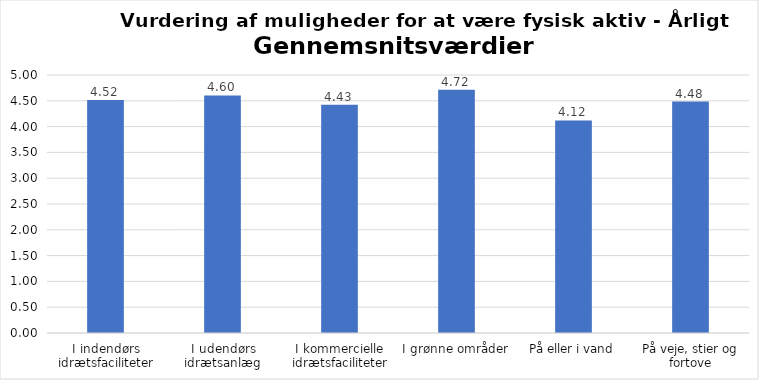
| Category | Gennemsnit |
|---|---|
| I indendørs idrætsfaciliteter | 4.515 |
| I udendørs idrætsanlæg | 4.604 |
| I kommercielle idrætsfaciliteter | 4.425 |
| I grønne områder | 4.716 |
| På eller i vand | 4.12 |
| På veje, stier og fortove | 4.485 |